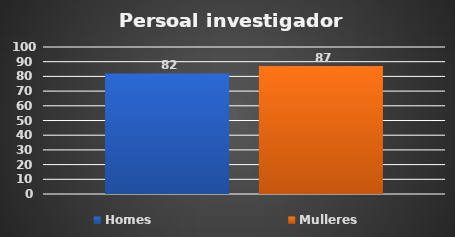
| Category | Homes | Mulleres |
|---|---|---|
| 0 | 82 | 87 |